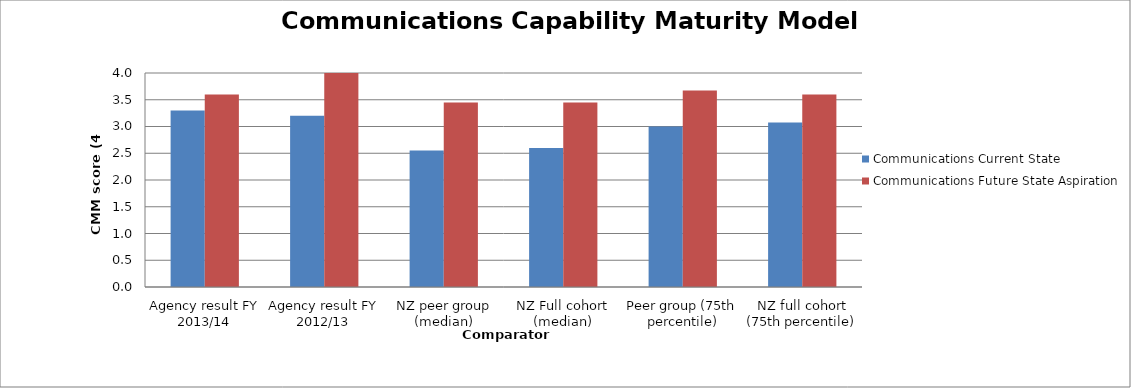
| Category | Communications Current State | Communications Future State Aspiration |
|---|---|---|
| Agency result FY 2013/14 | 3.3 | 3.6 |
| Agency result FY 2012/13 | 3.2 | 4 |
| NZ peer group (median) | 2.55 | 3.45 |
| NZ Full cohort (median) | 2.6 | 3.45 |
| Peer group (75th percentile) | 3 | 3.675 |
| NZ full cohort (75th percentile) | 3.075 | 3.6 |